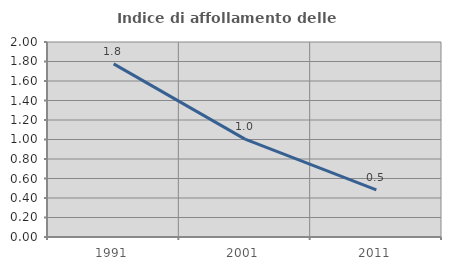
| Category | Indice di affollamento delle abitazioni  |
|---|---|
| 1991.0 | 1.775 |
| 2001.0 | 1.004 |
| 2011.0 | 0.484 |